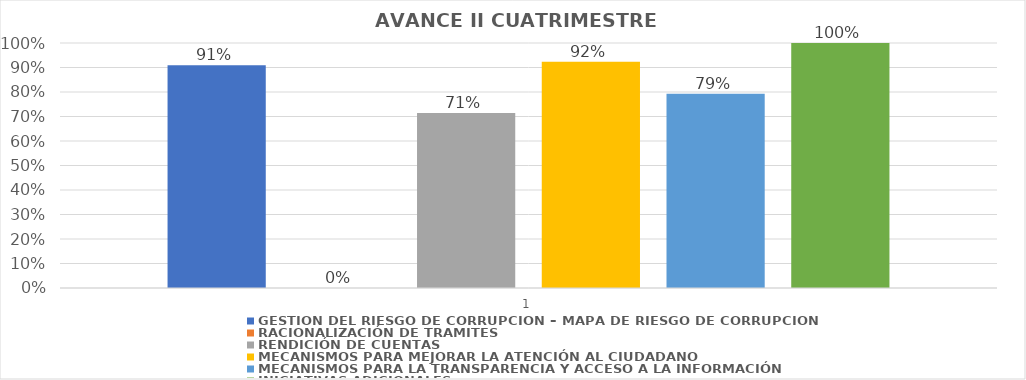
| Category | GESTIÓN DEL RIESGO DE CORRUPCIÓN – MAPA DE RIESGO DE CORRUPCIÓN  | RACIONALIZACIÓN DE TRAMITES | RENDICIÓN DE CUENTAS | MECANISMOS PARA MEJORAR LA ATENCIÓN AL CIUDADANO | MECANISMOS PARA LA TRANSPARENCIA Y ACCESO A LA INFORMACIÓN | INICIATIVAS ADICIONALES |
|---|---|---|---|---|---|---|
| 0 | 0.909 | 0 | 0.714 | 0.923 | 0.793 | 1 |